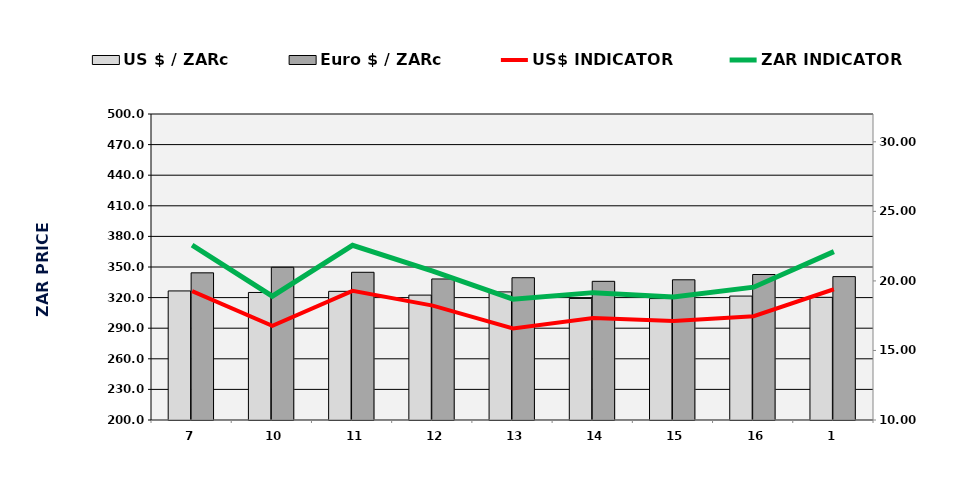
| Category | US $ / ZARc | Euro $ / ZARc |
|---|---|---|
| 7.0 | 19.28 | 20.58 |
| 10.0 | 19.17 | 20.98 |
| 11.0 | 19.25 | 20.62 |
| 12.0 | 18.98 | 20.14 |
| 13.0 | 19.21 | 20.23 |
| 14.0 | 18.74 | 19.97 |
| 15.0 | 18.73 | 20.08 |
| 16.0 | 18.91 | 20.46 |
| 1.0 | 18.82 | 20.31 |